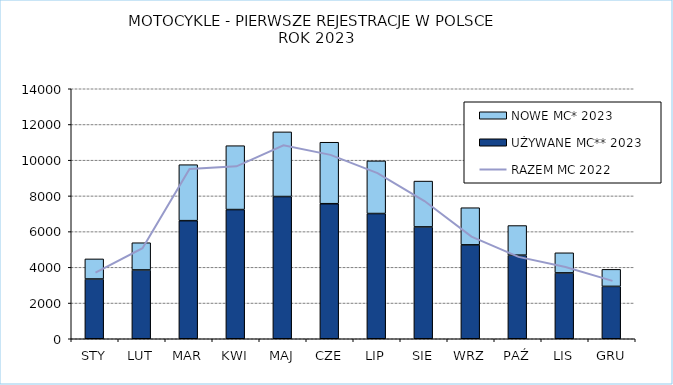
| Category | UŻYWANE MC** 2023 | NOWE MC* 2023 |
|---|---|---|
| STY | 3346 | 1126 |
| LUT | 3853 | 1524 |
| MAR | 6614 | 3134 |
| KWI | 7235 | 3577 |
| MAJ | 7965 | 3620 |
| CZE | 7563 | 3442 |
| LIP | 7013 | 2949 |
| SIE | 6263 | 2567 |
| WRZ | 5258 | 2080 |
| PAŹ | 4682 | 1658 |
| LIS | 3688 | 1126 |
| GRU | 2933 | 953 |